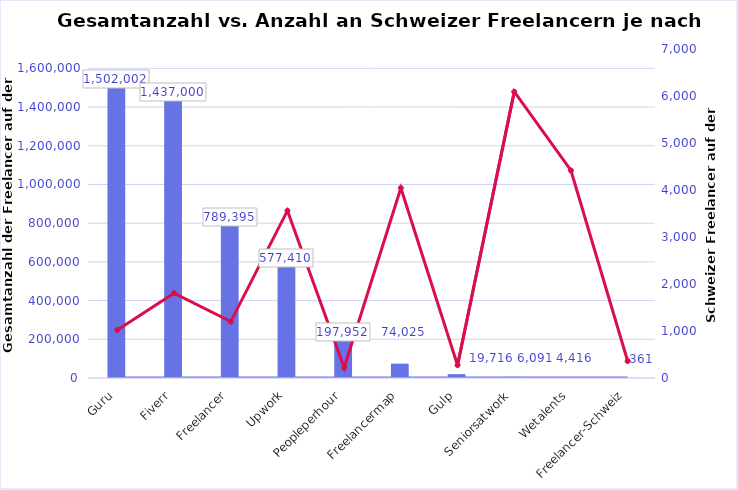
| Category | Freelancer Plattform  |
|---|---|
| Guru | 1502002 |
| Fiverr | 1437000 |
| Freelancer | 789395 |
| Upwork | 577410 |
| Peopleperhour | 197952 |
| Freelancermap | 74025 |
| Gulp | 19716 |
| Seniorsatwork | 6091 |
| Wetalents | 4416 |
| Freelancer-Schweiz | 361 |